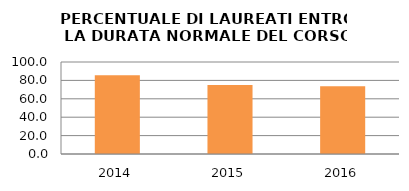
| Category | 2014 2015 2016 |
|---|---|
| 2014.0 | 85.714 |
| 2015.0 | 75.099 |
| 2016.0 | 73.649 |